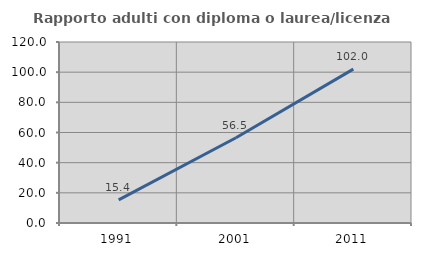
| Category | Rapporto adulti con diploma o laurea/licenza media  |
|---|---|
| 1991.0 | 15.361 |
| 2001.0 | 56.522 |
| 2011.0 | 101.99 |